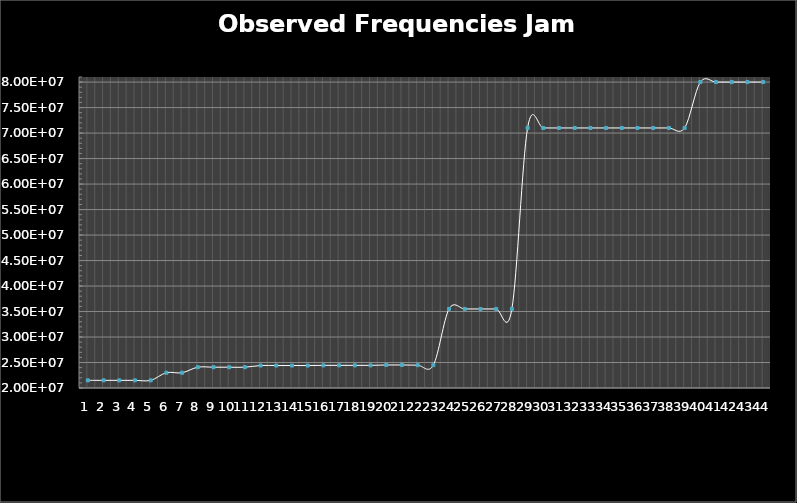
| Category | Series 0 |
|---|---|
| 0 | 21501183 |
| 1 | 21501169 |
| 2 | 21501199 |
| 3 | 21501232 |
| 4 | 21501161 |
| 5 | 22994188 |
| 6 | 22994141 |
| 7 | 24079528 |
| 8 | 24079517 |
| 9 | 24079471 |
| 10 | 24079377 |
| 11 | 24408334 |
| 12 | 24408257 |
| 13 | 24408302 |
| 14 | 24408303 |
| 15 | 24441908 |
| 16 | 24441804 |
| 17 | 24441827 |
| 18 | 24441898 |
| 19 | 24516967 |
| 20 | 24516778 |
| 21 | 24481126 |
| 22 | 24483239 |
| 23 | 35501829 |
| 24 | 35502609 |
| 25 | 35501805 |
| 26 | 35501755 |
| 27 | 35501888 |
| 28 | 71003696 |
| 29 | 71005797 |
| 30 | 71004225 |
| 31 | 71003837 |
| 32 | 71003244 |
| 33 | 71004393 |
| 34 | 71003862 |
| 35 | 71003633 |
| 36 | 71004293 |
| 37 | 71004195 |
| 38 | 71004120 |
| 39 | 80005054 |
| 40 | 80005558 |
| 41 | 80005620 |
| 42 | 80005025 |
| 43 | 80005634 |